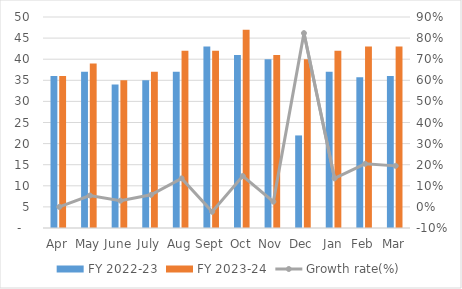
| Category | FY 2022-23 | FY 2023-24 |
|---|---|---|
| Apr | 36 | 36 |
| May | 37 | 39 |
| June | 34 | 35 |
| July | 35 | 37 |
| Aug | 37 | 42 |
| Sept | 43 | 42 |
| Oct | 41 | 47 |
| Nov | 40 | 41 |
| Dec | 21.934 | 40 |
| Jan | 37 | 42 |
| Feb | 35.706 | 43 |
| Mar | 36 | 43 |